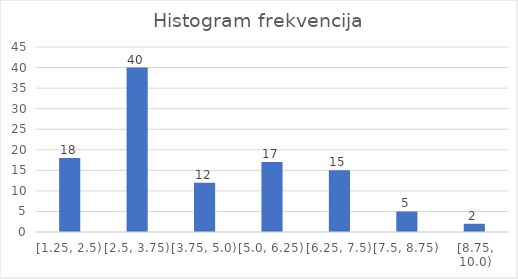
| Category | 18 |
|---|---|
| [1.25, 2.5) | 18 |
| [2.5, 3.75) | 40 |
| [3.75, 5.0) | 12 |
| [5.0, 6.25) | 17 |
| [6.25, 7.5) | 15 |
| [7.5, 8.75) | 5 |
| [8.75, 10.0) | 2 |